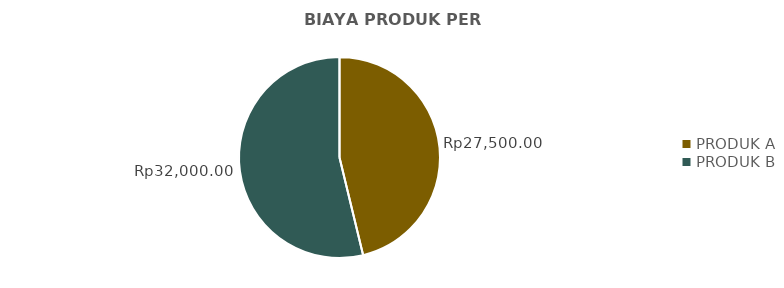
| Category | BIAYA PRODUK PER UNIT |
|---|---|
| PRODUK A | 27500 |
| PRODUK B | 32000 |